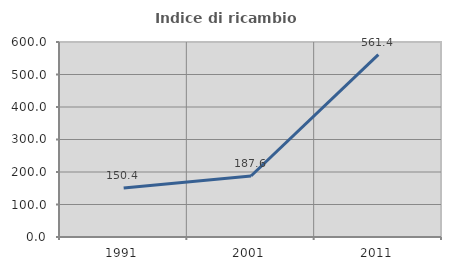
| Category | Indice di ricambio occupazionale  |
|---|---|
| 1991.0 | 150.42 |
| 2001.0 | 187.64 |
| 2011.0 | 561.364 |